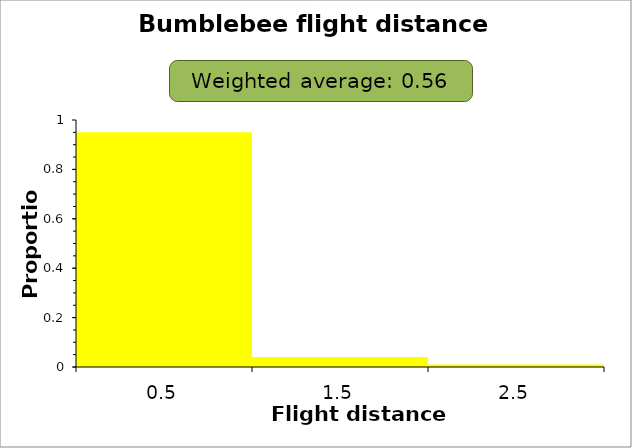
| Category | Proportion |
|---|---|
| 0.5 | 0.95 |
| 1.5 | 0.04 |
| 2.5 | 0.01 |